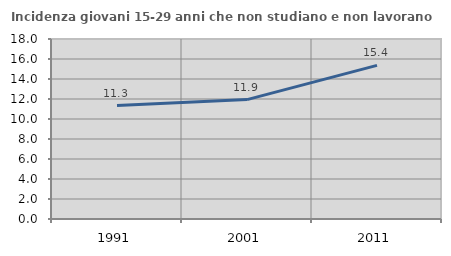
| Category | Incidenza giovani 15-29 anni che non studiano e non lavorano  |
|---|---|
| 1991.0 | 11.338 |
| 2001.0 | 11.938 |
| 2011.0 | 15.363 |